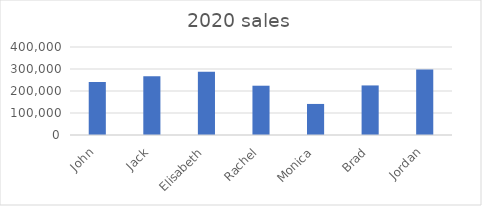
| Category | Series 0 |
|---|---|
| John | 240712 |
| Jack | 266889 |
| Elisabeth | 287887 |
| Rachel | 224030 |
| Monica | 141173 |
| Brad | 225329 |
| Jordan | 297437 |